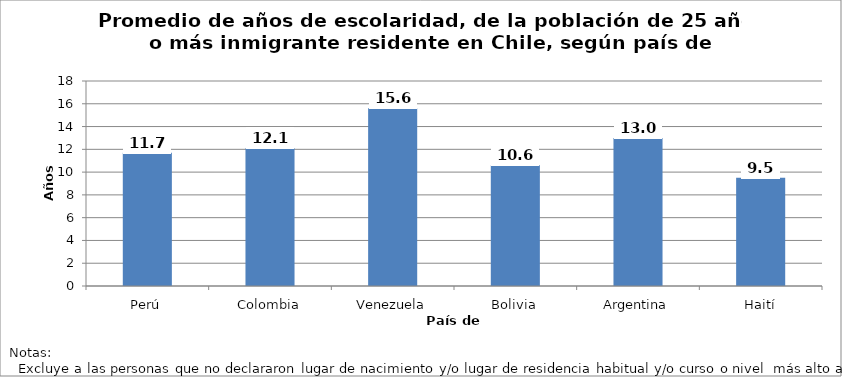
| Category | Años de escolaridad promedio |
|---|---|
| Perú | 11.7 |
| Colombia | 12.1 |
| Venezuela | 15.6 |
| Bolivia | 10.6 |
| Argentina | 13 |
| Haití | 9.5 |